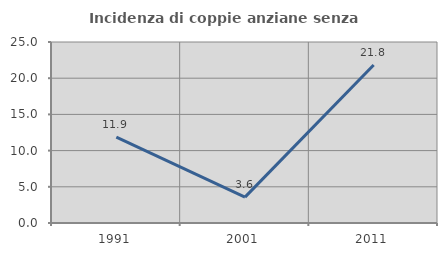
| Category | Incidenza di coppie anziane senza figli  |
|---|---|
| 1991.0 | 11.864 |
| 2001.0 | 3.571 |
| 2011.0 | 21.818 |